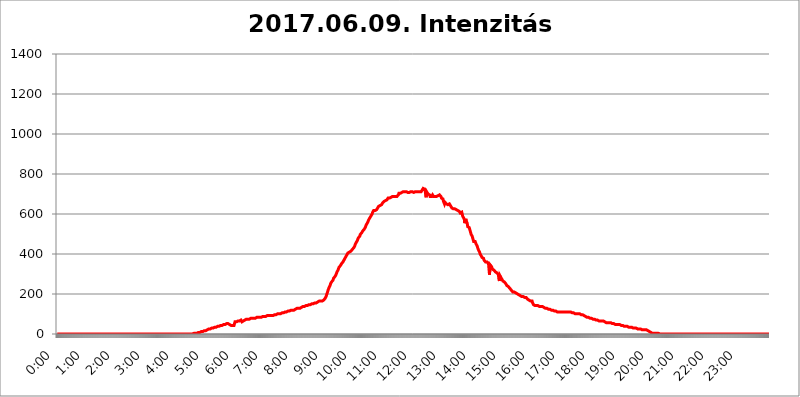
| Category | 2017.06.09. Intenzitás [W/m^2] |
|---|---|
| 0.0 | 0 |
| 0.0006944444444444445 | 0 |
| 0.001388888888888889 | 0 |
| 0.0020833333333333333 | 0 |
| 0.002777777777777778 | 0 |
| 0.003472222222222222 | 0 |
| 0.004166666666666667 | 0 |
| 0.004861111111111111 | 0 |
| 0.005555555555555556 | 0 |
| 0.0062499999999999995 | 0 |
| 0.006944444444444444 | 0 |
| 0.007638888888888889 | 0 |
| 0.008333333333333333 | 0 |
| 0.009027777777777779 | 0 |
| 0.009722222222222222 | 0 |
| 0.010416666666666666 | 0 |
| 0.011111111111111112 | 0 |
| 0.011805555555555555 | 0 |
| 0.012499999999999999 | 0 |
| 0.013194444444444444 | 0 |
| 0.013888888888888888 | 0 |
| 0.014583333333333332 | 0 |
| 0.015277777777777777 | 0 |
| 0.015972222222222224 | 0 |
| 0.016666666666666666 | 0 |
| 0.017361111111111112 | 0 |
| 0.018055555555555557 | 0 |
| 0.01875 | 0 |
| 0.019444444444444445 | 0 |
| 0.02013888888888889 | 0 |
| 0.020833333333333332 | 0 |
| 0.02152777777777778 | 0 |
| 0.022222222222222223 | 0 |
| 0.02291666666666667 | 0 |
| 0.02361111111111111 | 0 |
| 0.024305555555555556 | 0 |
| 0.024999999999999998 | 0 |
| 0.025694444444444447 | 0 |
| 0.02638888888888889 | 0 |
| 0.027083333333333334 | 0 |
| 0.027777777777777776 | 0 |
| 0.02847222222222222 | 0 |
| 0.029166666666666664 | 0 |
| 0.029861111111111113 | 0 |
| 0.030555555555555555 | 0 |
| 0.03125 | 0 |
| 0.03194444444444445 | 0 |
| 0.03263888888888889 | 0 |
| 0.03333333333333333 | 0 |
| 0.034027777777777775 | 0 |
| 0.034722222222222224 | 0 |
| 0.035416666666666666 | 0 |
| 0.036111111111111115 | 0 |
| 0.03680555555555556 | 0 |
| 0.0375 | 0 |
| 0.03819444444444444 | 0 |
| 0.03888888888888889 | 0 |
| 0.03958333333333333 | 0 |
| 0.04027777777777778 | 0 |
| 0.04097222222222222 | 0 |
| 0.041666666666666664 | 0 |
| 0.042361111111111106 | 0 |
| 0.04305555555555556 | 0 |
| 0.043750000000000004 | 0 |
| 0.044444444444444446 | 0 |
| 0.04513888888888889 | 0 |
| 0.04583333333333334 | 0 |
| 0.04652777777777778 | 0 |
| 0.04722222222222222 | 0 |
| 0.04791666666666666 | 0 |
| 0.04861111111111111 | 0 |
| 0.049305555555555554 | 0 |
| 0.049999999999999996 | 0 |
| 0.05069444444444445 | 0 |
| 0.051388888888888894 | 0 |
| 0.052083333333333336 | 0 |
| 0.05277777777777778 | 0 |
| 0.05347222222222222 | 0 |
| 0.05416666666666667 | 0 |
| 0.05486111111111111 | 0 |
| 0.05555555555555555 | 0 |
| 0.05625 | 0 |
| 0.05694444444444444 | 0 |
| 0.057638888888888885 | 0 |
| 0.05833333333333333 | 0 |
| 0.05902777777777778 | 0 |
| 0.059722222222222225 | 0 |
| 0.06041666666666667 | 0 |
| 0.061111111111111116 | 0 |
| 0.06180555555555556 | 0 |
| 0.0625 | 0 |
| 0.06319444444444444 | 0 |
| 0.06388888888888888 | 0 |
| 0.06458333333333334 | 0 |
| 0.06527777777777778 | 0 |
| 0.06597222222222222 | 0 |
| 0.06666666666666667 | 0 |
| 0.06736111111111111 | 0 |
| 0.06805555555555555 | 0 |
| 0.06874999999999999 | 0 |
| 0.06944444444444443 | 0 |
| 0.07013888888888889 | 0 |
| 0.07083333333333333 | 0 |
| 0.07152777777777779 | 0 |
| 0.07222222222222223 | 0 |
| 0.07291666666666667 | 0 |
| 0.07361111111111111 | 0 |
| 0.07430555555555556 | 0 |
| 0.075 | 0 |
| 0.07569444444444444 | 0 |
| 0.0763888888888889 | 0 |
| 0.07708333333333334 | 0 |
| 0.07777777777777778 | 0 |
| 0.07847222222222222 | 0 |
| 0.07916666666666666 | 0 |
| 0.0798611111111111 | 0 |
| 0.08055555555555556 | 0 |
| 0.08125 | 0 |
| 0.08194444444444444 | 0 |
| 0.08263888888888889 | 0 |
| 0.08333333333333333 | 0 |
| 0.08402777777777777 | 0 |
| 0.08472222222222221 | 0 |
| 0.08541666666666665 | 0 |
| 0.08611111111111112 | 0 |
| 0.08680555555555557 | 0 |
| 0.08750000000000001 | 0 |
| 0.08819444444444445 | 0 |
| 0.08888888888888889 | 0 |
| 0.08958333333333333 | 0 |
| 0.09027777777777778 | 0 |
| 0.09097222222222222 | 0 |
| 0.09166666666666667 | 0 |
| 0.09236111111111112 | 0 |
| 0.09305555555555556 | 0 |
| 0.09375 | 0 |
| 0.09444444444444444 | 0 |
| 0.09513888888888888 | 0 |
| 0.09583333333333333 | 0 |
| 0.09652777777777777 | 0 |
| 0.09722222222222222 | 0 |
| 0.09791666666666667 | 0 |
| 0.09861111111111111 | 0 |
| 0.09930555555555555 | 0 |
| 0.09999999999999999 | 0 |
| 0.10069444444444443 | 0 |
| 0.1013888888888889 | 0 |
| 0.10208333333333335 | 0 |
| 0.10277777777777779 | 0 |
| 0.10347222222222223 | 0 |
| 0.10416666666666667 | 0 |
| 0.10486111111111111 | 0 |
| 0.10555555555555556 | 0 |
| 0.10625 | 0 |
| 0.10694444444444444 | 0 |
| 0.1076388888888889 | 0 |
| 0.10833333333333334 | 0 |
| 0.10902777777777778 | 0 |
| 0.10972222222222222 | 0 |
| 0.1111111111111111 | 0 |
| 0.11180555555555556 | 0 |
| 0.11180555555555556 | 0 |
| 0.1125 | 0 |
| 0.11319444444444444 | 0 |
| 0.11388888888888889 | 0 |
| 0.11458333333333333 | 0 |
| 0.11527777777777777 | 0 |
| 0.11597222222222221 | 0 |
| 0.11666666666666665 | 0 |
| 0.1173611111111111 | 0 |
| 0.11805555555555557 | 0 |
| 0.11944444444444445 | 0 |
| 0.12013888888888889 | 0 |
| 0.12083333333333333 | 0 |
| 0.12152777777777778 | 0 |
| 0.12222222222222223 | 0 |
| 0.12291666666666667 | 0 |
| 0.12291666666666667 | 0 |
| 0.12361111111111112 | 0 |
| 0.12430555555555556 | 0 |
| 0.125 | 0 |
| 0.12569444444444444 | 0 |
| 0.12638888888888888 | 0 |
| 0.12708333333333333 | 0 |
| 0.16875 | 0 |
| 0.12847222222222224 | 0 |
| 0.12916666666666668 | 0 |
| 0.12986111111111112 | 0 |
| 0.13055555555555556 | 0 |
| 0.13125 | 0 |
| 0.13194444444444445 | 0 |
| 0.1326388888888889 | 0 |
| 0.13333333333333333 | 0 |
| 0.13402777777777777 | 0 |
| 0.13402777777777777 | 0 |
| 0.13472222222222222 | 0 |
| 0.13541666666666666 | 0 |
| 0.1361111111111111 | 0 |
| 0.13749999999999998 | 0 |
| 0.13819444444444443 | 0 |
| 0.1388888888888889 | 0 |
| 0.13958333333333334 | 0 |
| 0.14027777777777778 | 0 |
| 0.14097222222222222 | 0 |
| 0.14166666666666666 | 0 |
| 0.1423611111111111 | 0 |
| 0.14305555555555557 | 0 |
| 0.14375000000000002 | 0 |
| 0.14444444444444446 | 0 |
| 0.1451388888888889 | 0 |
| 0.1451388888888889 | 0 |
| 0.14652777777777778 | 0 |
| 0.14722222222222223 | 0 |
| 0.14791666666666667 | 0 |
| 0.1486111111111111 | 0 |
| 0.14930555555555555 | 0 |
| 0.15 | 0 |
| 0.15069444444444444 | 0 |
| 0.15138888888888888 | 0 |
| 0.15208333333333332 | 0 |
| 0.15277777777777776 | 0 |
| 0.15347222222222223 | 0 |
| 0.15416666666666667 | 0 |
| 0.15486111111111112 | 0 |
| 0.15555555555555556 | 0 |
| 0.15625 | 0 |
| 0.15694444444444444 | 0 |
| 0.15763888888888888 | 0 |
| 0.15833333333333333 | 0 |
| 0.15902777777777777 | 0 |
| 0.15972222222222224 | 0 |
| 0.16041666666666668 | 0 |
| 0.16111111111111112 | 0 |
| 0.16180555555555556 | 0 |
| 0.1625 | 0 |
| 0.16319444444444445 | 0 |
| 0.1638888888888889 | 0 |
| 0.16458333333333333 | 0 |
| 0.16527777777777777 | 0 |
| 0.16597222222222222 | 0 |
| 0.16666666666666666 | 0 |
| 0.1673611111111111 | 0 |
| 0.16805555555555554 | 0 |
| 0.16874999999999998 | 0 |
| 0.16944444444444443 | 0 |
| 0.17013888888888887 | 0 |
| 0.1708333333333333 | 0 |
| 0.17152777777777775 | 0 |
| 0.17222222222222225 | 0 |
| 0.1729166666666667 | 0 |
| 0.17361111111111113 | 0 |
| 0.17430555555555557 | 0 |
| 0.17500000000000002 | 0 |
| 0.17569444444444446 | 0 |
| 0.1763888888888889 | 0 |
| 0.17708333333333334 | 0 |
| 0.17777777777777778 | 0 |
| 0.17847222222222223 | 0 |
| 0.17916666666666667 | 0 |
| 0.1798611111111111 | 0 |
| 0.18055555555555555 | 0 |
| 0.18125 | 0 |
| 0.18194444444444444 | 0 |
| 0.1826388888888889 | 0 |
| 0.18333333333333335 | 0 |
| 0.1840277777777778 | 0 |
| 0.18472222222222223 | 0 |
| 0.18541666666666667 | 0 |
| 0.18611111111111112 | 0 |
| 0.18680555555555556 | 0 |
| 0.1875 | 0 |
| 0.18819444444444444 | 0 |
| 0.18888888888888888 | 0 |
| 0.18958333333333333 | 0 |
| 0.19027777777777777 | 3.525 |
| 0.1909722222222222 | 3.525 |
| 0.19166666666666665 | 3.525 |
| 0.19236111111111112 | 3.525 |
| 0.19305555555555554 | 3.525 |
| 0.19375 | 3.525 |
| 0.19444444444444445 | 3.525 |
| 0.1951388888888889 | 3.525 |
| 0.19583333333333333 | 3.525 |
| 0.19652777777777777 | 3.525 |
| 0.19722222222222222 | 7.887 |
| 0.19791666666666666 | 7.887 |
| 0.1986111111111111 | 7.887 |
| 0.19930555555555554 | 7.887 |
| 0.19999999999999998 | 7.887 |
| 0.20069444444444443 | 12.257 |
| 0.20138888888888887 | 12.257 |
| 0.2020833333333333 | 12.257 |
| 0.2027777777777778 | 12.257 |
| 0.2034722222222222 | 12.257 |
| 0.2041666666666667 | 12.257 |
| 0.20486111111111113 | 16.636 |
| 0.20555555555555557 | 16.636 |
| 0.20625000000000002 | 16.636 |
| 0.20694444444444446 | 16.636 |
| 0.2076388888888889 | 16.636 |
| 0.20833333333333334 | 16.636 |
| 0.20902777777777778 | 21.024 |
| 0.20972222222222223 | 21.024 |
| 0.21041666666666667 | 21.024 |
| 0.2111111111111111 | 21.024 |
| 0.21180555555555555 | 21.024 |
| 0.2125 | 25.419 |
| 0.21319444444444444 | 25.419 |
| 0.2138888888888889 | 25.419 |
| 0.21458333333333335 | 25.419 |
| 0.2152777777777778 | 29.823 |
| 0.21597222222222223 | 29.823 |
| 0.21666666666666667 | 29.823 |
| 0.21736111111111112 | 29.823 |
| 0.21805555555555556 | 29.823 |
| 0.21875 | 29.823 |
| 0.21944444444444444 | 29.823 |
| 0.22013888888888888 | 34.234 |
| 0.22083333333333333 | 34.234 |
| 0.22152777777777777 | 34.234 |
| 0.2222222222222222 | 34.234 |
| 0.22291666666666665 | 34.234 |
| 0.2236111111111111 | 38.653 |
| 0.22430555555555556 | 38.653 |
| 0.225 | 38.653 |
| 0.22569444444444445 | 38.653 |
| 0.2263888888888889 | 38.653 |
| 0.22708333333333333 | 38.653 |
| 0.22777777777777777 | 38.653 |
| 0.22847222222222222 | 43.079 |
| 0.22916666666666666 | 43.079 |
| 0.2298611111111111 | 43.079 |
| 0.23055555555555554 | 43.079 |
| 0.23124999999999998 | 43.079 |
| 0.23194444444444443 | 47.511 |
| 0.23263888888888887 | 47.511 |
| 0.2333333333333333 | 47.511 |
| 0.2340277777777778 | 47.511 |
| 0.2347222222222222 | 47.511 |
| 0.2354166666666667 | 47.511 |
| 0.23611111111111113 | 47.511 |
| 0.23680555555555557 | 51.951 |
| 0.23750000000000002 | 51.951 |
| 0.23819444444444446 | 51.951 |
| 0.2388888888888889 | 51.951 |
| 0.23958333333333334 | 51.951 |
| 0.24027777777777778 | 51.951 |
| 0.24097222222222223 | 51.951 |
| 0.24166666666666667 | 47.511 |
| 0.2423611111111111 | 43.079 |
| 0.24305555555555555 | 43.079 |
| 0.24375 | 43.079 |
| 0.24444444444444446 | 43.079 |
| 0.24513888888888888 | 43.079 |
| 0.24583333333333335 | 43.079 |
| 0.2465277777777778 | 43.079 |
| 0.24722222222222223 | 43.079 |
| 0.24791666666666667 | 43.079 |
| 0.24861111111111112 | 51.951 |
| 0.24930555555555556 | 60.85 |
| 0.25 | 60.85 |
| 0.25069444444444444 | 56.398 |
| 0.2513888888888889 | 60.85 |
| 0.2520833333333333 | 65.31 |
| 0.25277777777777777 | 65.31 |
| 0.2534722222222222 | 65.31 |
| 0.25416666666666665 | 65.31 |
| 0.2548611111111111 | 65.31 |
| 0.2555555555555556 | 65.31 |
| 0.25625000000000003 | 65.31 |
| 0.2569444444444445 | 65.31 |
| 0.2576388888888889 | 69.775 |
| 0.25833333333333336 | 69.775 |
| 0.2590277777777778 | 60.85 |
| 0.25972222222222224 | 56.398 |
| 0.2604166666666667 | 60.85 |
| 0.2611111111111111 | 65.31 |
| 0.26180555555555557 | 65.31 |
| 0.2625 | 65.31 |
| 0.26319444444444445 | 69.775 |
| 0.2638888888888889 | 74.246 |
| 0.26458333333333334 | 74.246 |
| 0.2652777777777778 | 74.246 |
| 0.2659722222222222 | 74.246 |
| 0.26666666666666666 | 74.246 |
| 0.2673611111111111 | 74.246 |
| 0.26805555555555555 | 74.246 |
| 0.26875 | 74.246 |
| 0.26944444444444443 | 74.246 |
| 0.2701388888888889 | 74.246 |
| 0.2708333333333333 | 74.246 |
| 0.27152777777777776 | 78.722 |
| 0.2722222222222222 | 74.246 |
| 0.27291666666666664 | 78.722 |
| 0.2736111111111111 | 78.722 |
| 0.2743055555555555 | 78.722 |
| 0.27499999999999997 | 78.722 |
| 0.27569444444444446 | 78.722 |
| 0.27638888888888885 | 78.722 |
| 0.27708333333333335 | 78.722 |
| 0.2777777777777778 | 78.722 |
| 0.27847222222222223 | 78.722 |
| 0.2791666666666667 | 78.722 |
| 0.2798611111111111 | 83.205 |
| 0.28055555555555556 | 83.205 |
| 0.28125 | 83.205 |
| 0.28194444444444444 | 83.205 |
| 0.2826388888888889 | 83.205 |
| 0.2833333333333333 | 83.205 |
| 0.28402777777777777 | 83.205 |
| 0.2847222222222222 | 83.205 |
| 0.28541666666666665 | 83.205 |
| 0.28611111111111115 | 83.205 |
| 0.28680555555555554 | 83.205 |
| 0.28750000000000003 | 87.692 |
| 0.2881944444444445 | 87.692 |
| 0.2888888888888889 | 87.692 |
| 0.28958333333333336 | 87.692 |
| 0.2902777777777778 | 87.692 |
| 0.29097222222222224 | 87.692 |
| 0.2916666666666667 | 87.692 |
| 0.2923611111111111 | 87.692 |
| 0.29305555555555557 | 92.184 |
| 0.29375 | 92.184 |
| 0.29444444444444445 | 92.184 |
| 0.2951388888888889 | 92.184 |
| 0.29583333333333334 | 92.184 |
| 0.2965277777777778 | 92.184 |
| 0.2972222222222222 | 92.184 |
| 0.29791666666666666 | 92.184 |
| 0.2986111111111111 | 92.184 |
| 0.29930555555555555 | 92.184 |
| 0.3 | 92.184 |
| 0.30069444444444443 | 92.184 |
| 0.3013888888888889 | 96.682 |
| 0.3020833333333333 | 96.682 |
| 0.30277777777777776 | 92.184 |
| 0.3034722222222222 | 96.682 |
| 0.30416666666666664 | 96.682 |
| 0.3048611111111111 | 96.682 |
| 0.3055555555555555 | 96.682 |
| 0.30624999999999997 | 96.682 |
| 0.3069444444444444 | 96.682 |
| 0.3076388888888889 | 96.682 |
| 0.30833333333333335 | 101.184 |
| 0.3090277777777778 | 101.184 |
| 0.30972222222222223 | 101.184 |
| 0.3104166666666667 | 101.184 |
| 0.3111111111111111 | 101.184 |
| 0.31180555555555556 | 101.184 |
| 0.3125 | 101.184 |
| 0.31319444444444444 | 101.184 |
| 0.3138888888888889 | 101.184 |
| 0.3145833333333333 | 105.69 |
| 0.31527777777777777 | 105.69 |
| 0.3159722222222222 | 105.69 |
| 0.31666666666666665 | 105.69 |
| 0.31736111111111115 | 105.69 |
| 0.31805555555555554 | 110.201 |
| 0.31875000000000003 | 110.201 |
| 0.3194444444444445 | 110.201 |
| 0.3201388888888889 | 110.201 |
| 0.32083333333333336 | 110.201 |
| 0.3215277777777778 | 110.201 |
| 0.32222222222222224 | 110.201 |
| 0.3229166666666667 | 114.716 |
| 0.3236111111111111 | 114.716 |
| 0.32430555555555557 | 114.716 |
| 0.325 | 114.716 |
| 0.32569444444444445 | 114.716 |
| 0.3263888888888889 | 114.716 |
| 0.32708333333333334 | 114.716 |
| 0.3277777777777778 | 119.235 |
| 0.3284722222222222 | 119.235 |
| 0.32916666666666666 | 119.235 |
| 0.3298611111111111 | 119.235 |
| 0.33055555555555555 | 119.235 |
| 0.33125 | 123.758 |
| 0.33194444444444443 | 119.235 |
| 0.3326388888888889 | 123.758 |
| 0.3333333333333333 | 123.758 |
| 0.3340277777777778 | 123.758 |
| 0.3347222222222222 | 123.758 |
| 0.3354166666666667 | 128.284 |
| 0.3361111111111111 | 128.284 |
| 0.3368055555555556 | 128.284 |
| 0.33749999999999997 | 128.284 |
| 0.33819444444444446 | 128.284 |
| 0.33888888888888885 | 128.284 |
| 0.33958333333333335 | 128.284 |
| 0.34027777777777773 | 128.284 |
| 0.34097222222222223 | 132.814 |
| 0.3416666666666666 | 132.814 |
| 0.3423611111111111 | 132.814 |
| 0.3430555555555555 | 132.814 |
| 0.34375 | 137.347 |
| 0.3444444444444445 | 137.347 |
| 0.3451388888888889 | 137.347 |
| 0.3458333333333334 | 137.347 |
| 0.34652777777777777 | 137.347 |
| 0.34722222222222227 | 137.347 |
| 0.34791666666666665 | 137.347 |
| 0.34861111111111115 | 141.884 |
| 0.34930555555555554 | 141.884 |
| 0.35000000000000003 | 141.884 |
| 0.3506944444444444 | 141.884 |
| 0.3513888888888889 | 141.884 |
| 0.3520833333333333 | 146.423 |
| 0.3527777777777778 | 146.423 |
| 0.3534722222222222 | 146.423 |
| 0.3541666666666667 | 146.423 |
| 0.3548611111111111 | 146.423 |
| 0.35555555555555557 | 146.423 |
| 0.35625 | 146.423 |
| 0.35694444444444445 | 150.964 |
| 0.3576388888888889 | 150.964 |
| 0.35833333333333334 | 150.964 |
| 0.3590277777777778 | 150.964 |
| 0.3597222222222222 | 155.509 |
| 0.36041666666666666 | 155.509 |
| 0.3611111111111111 | 155.509 |
| 0.36180555555555555 | 155.509 |
| 0.3625 | 155.509 |
| 0.36319444444444443 | 155.509 |
| 0.3638888888888889 | 160.056 |
| 0.3645833333333333 | 160.056 |
| 0.3652777777777778 | 160.056 |
| 0.3659722222222222 | 160.056 |
| 0.3666666666666667 | 160.056 |
| 0.3673611111111111 | 164.605 |
| 0.3680555555555556 | 164.605 |
| 0.36874999999999997 | 164.605 |
| 0.36944444444444446 | 164.605 |
| 0.37013888888888885 | 164.605 |
| 0.37083333333333335 | 164.605 |
| 0.37152777777777773 | 164.605 |
| 0.37222222222222223 | 169.156 |
| 0.3729166666666666 | 169.156 |
| 0.3736111111111111 | 169.156 |
| 0.3743055555555555 | 169.156 |
| 0.375 | 173.709 |
| 0.3756944444444445 | 178.264 |
| 0.3763888888888889 | 182.82 |
| 0.3770833333333334 | 187.378 |
| 0.37777777777777777 | 196.497 |
| 0.37847222222222227 | 201.058 |
| 0.37916666666666665 | 210.182 |
| 0.37986111111111115 | 219.309 |
| 0.38055555555555554 | 223.873 |
| 0.38125000000000003 | 233 |
| 0.3819444444444444 | 237.564 |
| 0.3826388888888889 | 242.127 |
| 0.3833333333333333 | 251.251 |
| 0.3840277777777778 | 255.813 |
| 0.3847222222222222 | 260.373 |
| 0.3854166666666667 | 264.932 |
| 0.3861111111111111 | 264.932 |
| 0.38680555555555557 | 269.49 |
| 0.3875 | 278.603 |
| 0.38819444444444445 | 278.603 |
| 0.3888888888888889 | 283.156 |
| 0.38958333333333334 | 287.709 |
| 0.3902777777777778 | 292.259 |
| 0.3909722222222222 | 296.808 |
| 0.39166666666666666 | 301.354 |
| 0.3923611111111111 | 310.44 |
| 0.39305555555555555 | 314.98 |
| 0.39375 | 319.517 |
| 0.39444444444444443 | 324.052 |
| 0.3951388888888889 | 333.113 |
| 0.3958333333333333 | 333.113 |
| 0.3965277777777778 | 337.639 |
| 0.3972222222222222 | 342.162 |
| 0.3979166666666667 | 346.682 |
| 0.3986111111111111 | 351.198 |
| 0.3993055555555556 | 355.712 |
| 0.39999999999999997 | 355.712 |
| 0.40069444444444446 | 360.221 |
| 0.40138888888888885 | 364.728 |
| 0.40208333333333335 | 369.23 |
| 0.40277777777777773 | 373.729 |
| 0.40347222222222223 | 378.224 |
| 0.4041666666666666 | 382.715 |
| 0.4048611111111111 | 387.202 |
| 0.4055555555555555 | 391.685 |
| 0.40625 | 396.164 |
| 0.4069444444444445 | 400.638 |
| 0.4076388888888889 | 405.108 |
| 0.4083333333333334 | 405.108 |
| 0.40902777777777777 | 409.574 |
| 0.40972222222222227 | 409.574 |
| 0.41041666666666665 | 414.035 |
| 0.41111111111111115 | 414.035 |
| 0.41180555555555554 | 414.035 |
| 0.41250000000000003 | 418.492 |
| 0.4131944444444444 | 418.492 |
| 0.4138888888888889 | 422.943 |
| 0.4145833333333333 | 427.39 |
| 0.4152777777777778 | 427.39 |
| 0.4159722222222222 | 431.833 |
| 0.4166666666666667 | 436.27 |
| 0.4173611111111111 | 440.702 |
| 0.41805555555555557 | 449.551 |
| 0.41875 | 453.968 |
| 0.41944444444444445 | 458.38 |
| 0.4201388888888889 | 458.38 |
| 0.42083333333333334 | 467.187 |
| 0.4215277777777778 | 471.582 |
| 0.4222222222222222 | 480.356 |
| 0.42291666666666666 | 480.356 |
| 0.4236111111111111 | 484.735 |
| 0.42430555555555555 | 489.108 |
| 0.425 | 497.836 |
| 0.42569444444444443 | 497.836 |
| 0.4263888888888889 | 502.192 |
| 0.4270833333333333 | 506.542 |
| 0.4277777777777778 | 510.885 |
| 0.4284722222222222 | 515.223 |
| 0.4291666666666667 | 515.223 |
| 0.4298611111111111 | 519.555 |
| 0.4305555555555556 | 523.88 |
| 0.43124999999999997 | 528.2 |
| 0.43194444444444446 | 532.513 |
| 0.43263888888888885 | 536.82 |
| 0.43333333333333335 | 545.416 |
| 0.43402777777777773 | 549.704 |
| 0.43472222222222223 | 549.704 |
| 0.4354166666666666 | 558.261 |
| 0.4361111111111111 | 562.53 |
| 0.4368055555555555 | 571.049 |
| 0.4375 | 575.299 |
| 0.4381944444444445 | 579.542 |
| 0.4388888888888889 | 583.779 |
| 0.4395833333333334 | 583.779 |
| 0.44027777777777777 | 592.233 |
| 0.44097222222222227 | 596.45 |
| 0.44166666666666665 | 600.661 |
| 0.44236111111111115 | 609.062 |
| 0.44305555555555554 | 613.252 |
| 0.44375000000000003 | 617.436 |
| 0.4444444444444444 | 617.436 |
| 0.4451388888888889 | 617.436 |
| 0.4458333333333333 | 617.436 |
| 0.4465277777777778 | 621.613 |
| 0.4472222222222222 | 621.613 |
| 0.4479166666666667 | 621.613 |
| 0.4486111111111111 | 625.784 |
| 0.44930555555555557 | 629.948 |
| 0.45 | 634.105 |
| 0.45069444444444445 | 638.256 |
| 0.4513888888888889 | 642.4 |
| 0.45208333333333334 | 638.256 |
| 0.4527777777777778 | 642.4 |
| 0.4534722222222222 | 642.4 |
| 0.45416666666666666 | 646.537 |
| 0.4548611111111111 | 646.537 |
| 0.45555555555555555 | 650.667 |
| 0.45625 | 654.791 |
| 0.45694444444444443 | 658.909 |
| 0.4576388888888889 | 658.909 |
| 0.4583333333333333 | 663.019 |
| 0.4590277777777778 | 663.019 |
| 0.4597222222222222 | 663.019 |
| 0.4604166666666667 | 667.123 |
| 0.4611111111111111 | 671.22 |
| 0.4618055555555556 | 671.22 |
| 0.46249999999999997 | 671.22 |
| 0.46319444444444446 | 675.311 |
| 0.46388888888888885 | 679.395 |
| 0.46458333333333335 | 679.395 |
| 0.46527777777777773 | 683.473 |
| 0.46597222222222223 | 679.395 |
| 0.4666666666666666 | 679.395 |
| 0.4673611111111111 | 683.473 |
| 0.4680555555555555 | 683.473 |
| 0.46875 | 687.544 |
| 0.4694444444444445 | 687.544 |
| 0.4701388888888889 | 687.544 |
| 0.4708333333333334 | 687.544 |
| 0.47152777777777777 | 687.544 |
| 0.47222222222222227 | 687.544 |
| 0.47291666666666665 | 687.544 |
| 0.47361111111111115 | 687.544 |
| 0.47430555555555554 | 687.544 |
| 0.47500000000000003 | 683.473 |
| 0.4756944444444444 | 683.473 |
| 0.4763888888888889 | 687.544 |
| 0.4770833333333333 | 687.544 |
| 0.4777777777777778 | 691.608 |
| 0.4784722222222222 | 695.666 |
| 0.4791666666666667 | 703.762 |
| 0.4798611111111111 | 699.717 |
| 0.48055555555555557 | 703.762 |
| 0.48125 | 703.762 |
| 0.48194444444444445 | 703.762 |
| 0.4826388888888889 | 703.762 |
| 0.48333333333333334 | 707.8 |
| 0.4840277777777778 | 707.8 |
| 0.4847222222222222 | 711.832 |
| 0.48541666666666666 | 711.832 |
| 0.4861111111111111 | 711.832 |
| 0.48680555555555555 | 711.832 |
| 0.4875 | 711.832 |
| 0.48819444444444443 | 715.858 |
| 0.4888888888888889 | 711.832 |
| 0.4895833333333333 | 711.832 |
| 0.4902777777777778 | 707.8 |
| 0.4909722222222222 | 707.8 |
| 0.4916666666666667 | 707.8 |
| 0.4923611111111111 | 703.762 |
| 0.4930555555555556 | 707.8 |
| 0.49374999999999997 | 707.8 |
| 0.49444444444444446 | 707.8 |
| 0.49513888888888885 | 707.8 |
| 0.49583333333333335 | 711.832 |
| 0.49652777777777773 | 707.8 |
| 0.49722222222222223 | 711.832 |
| 0.4979166666666666 | 711.832 |
| 0.4986111111111111 | 711.832 |
| 0.4993055555555555 | 707.8 |
| 0.5 | 707.8 |
| 0.5006944444444444 | 707.8 |
| 0.5013888888888889 | 707.8 |
| 0.5020833333333333 | 711.832 |
| 0.5027777777777778 | 711.832 |
| 0.5034722222222222 | 711.832 |
| 0.5041666666666667 | 711.832 |
| 0.5048611111111111 | 711.832 |
| 0.5055555555555555 | 715.858 |
| 0.50625 | 711.832 |
| 0.5069444444444444 | 711.832 |
| 0.5076388888888889 | 711.832 |
| 0.5083333333333333 | 711.832 |
| 0.5090277777777777 | 711.832 |
| 0.5097222222222222 | 711.832 |
| 0.5104166666666666 | 711.832 |
| 0.5111111111111112 | 711.832 |
| 0.5118055555555555 | 719.877 |
| 0.5125000000000001 | 723.889 |
| 0.5131944444444444 | 727.896 |
| 0.513888888888889 | 731.896 |
| 0.5145833333333333 | 731.896 |
| 0.5152777777777778 | 723.889 |
| 0.5159722222222222 | 715.858 |
| 0.5166666666666667 | 711.832 |
| 0.517361111111111 | 683.473 |
| 0.5180555555555556 | 711.832 |
| 0.5187499999999999 | 711.832 |
| 0.5194444444444445 | 707.8 |
| 0.5201388888888888 | 699.717 |
| 0.5208333333333334 | 695.666 |
| 0.5215277777777778 | 699.717 |
| 0.5222222222222223 | 695.666 |
| 0.5229166666666667 | 687.544 |
| 0.5236111111111111 | 687.544 |
| 0.5243055555555556 | 691.608 |
| 0.525 | 687.544 |
| 0.5256944444444445 | 691.608 |
| 0.5263888888888889 | 695.666 |
| 0.5270833333333333 | 691.608 |
| 0.5277777777777778 | 687.544 |
| 0.5284722222222222 | 687.544 |
| 0.5291666666666667 | 683.473 |
| 0.5298611111111111 | 687.544 |
| 0.5305555555555556 | 687.544 |
| 0.53125 | 687.544 |
| 0.5319444444444444 | 687.544 |
| 0.5326388888888889 | 687.544 |
| 0.5333333333333333 | 691.608 |
| 0.5340277777777778 | 691.608 |
| 0.5347222222222222 | 691.608 |
| 0.5354166666666667 | 695.666 |
| 0.5361111111111111 | 695.666 |
| 0.5368055555555555 | 695.666 |
| 0.5375 | 695.666 |
| 0.5381944444444444 | 687.544 |
| 0.5388888888888889 | 679.395 |
| 0.5395833333333333 | 683.473 |
| 0.5402777777777777 | 683.473 |
| 0.5409722222222222 | 675.311 |
| 0.5416666666666666 | 663.019 |
| 0.5423611111111112 | 658.909 |
| 0.5430555555555555 | 650.667 |
| 0.5437500000000001 | 658.909 |
| 0.5444444444444444 | 654.791 |
| 0.545138888888889 | 654.791 |
| 0.5458333333333333 | 650.667 |
| 0.5465277777777778 | 654.791 |
| 0.5472222222222222 | 650.667 |
| 0.5479166666666667 | 646.537 |
| 0.548611111111111 | 650.667 |
| 0.5493055555555556 | 650.667 |
| 0.5499999999999999 | 650.667 |
| 0.5506944444444445 | 650.667 |
| 0.5513888888888888 | 646.537 |
| 0.5520833333333334 | 638.256 |
| 0.5527777777777778 | 634.105 |
| 0.5534722222222223 | 629.948 |
| 0.5541666666666667 | 625.784 |
| 0.5548611111111111 | 625.784 |
| 0.5555555555555556 | 625.784 |
| 0.55625 | 625.784 |
| 0.5569444444444445 | 625.784 |
| 0.5576388888888889 | 625.784 |
| 0.5583333333333333 | 621.613 |
| 0.5590277777777778 | 621.613 |
| 0.5597222222222222 | 621.613 |
| 0.5604166666666667 | 621.613 |
| 0.5611111111111111 | 621.613 |
| 0.5618055555555556 | 617.436 |
| 0.5625 | 617.436 |
| 0.5631944444444444 | 617.436 |
| 0.5638888888888889 | 613.252 |
| 0.5645833333333333 | 609.062 |
| 0.5652777777777778 | 604.864 |
| 0.5659722222222222 | 604.864 |
| 0.5666666666666667 | 609.062 |
| 0.5673611111111111 | 609.062 |
| 0.5680555555555555 | 604.864 |
| 0.56875 | 588.009 |
| 0.5694444444444444 | 592.233 |
| 0.5701388888888889 | 588.009 |
| 0.5708333333333333 | 575.299 |
| 0.5715277777777777 | 553.986 |
| 0.5722222222222222 | 553.986 |
| 0.5729166666666666 | 575.299 |
| 0.5736111111111112 | 566.793 |
| 0.5743055555555555 | 566.793 |
| 0.5750000000000001 | 553.986 |
| 0.5756944444444444 | 536.82 |
| 0.576388888888889 | 532.513 |
| 0.5770833333333333 | 532.513 |
| 0.5777777777777778 | 532.513 |
| 0.5784722222222222 | 523.88 |
| 0.5791666666666667 | 519.555 |
| 0.579861111111111 | 506.542 |
| 0.5805555555555556 | 497.836 |
| 0.5812499999999999 | 497.836 |
| 0.5819444444444445 | 489.108 |
| 0.5826388888888888 | 480.356 |
| 0.5833333333333334 | 471.582 |
| 0.5840277777777778 | 462.786 |
| 0.5847222222222223 | 458.38 |
| 0.5854166666666667 | 462.786 |
| 0.5861111111111111 | 462.786 |
| 0.5868055555555556 | 458.38 |
| 0.5875 | 449.551 |
| 0.5881944444444445 | 445.129 |
| 0.5888888888888889 | 440.702 |
| 0.5895833333333333 | 431.833 |
| 0.5902777777777778 | 427.39 |
| 0.5909722222222222 | 418.492 |
| 0.5916666666666667 | 414.035 |
| 0.5923611111111111 | 409.574 |
| 0.5930555555555556 | 400.638 |
| 0.59375 | 396.164 |
| 0.5944444444444444 | 391.685 |
| 0.5951388888888889 | 387.202 |
| 0.5958333333333333 | 382.715 |
| 0.5965277777777778 | 382.715 |
| 0.5972222222222222 | 378.224 |
| 0.5979166666666667 | 378.224 |
| 0.5986111111111111 | 369.23 |
| 0.5993055555555555 | 369.23 |
| 0.6 | 364.728 |
| 0.6006944444444444 | 360.221 |
| 0.6013888888888889 | 355.712 |
| 0.6020833333333333 | 360.221 |
| 0.6027777777777777 | 360.221 |
| 0.6034722222222222 | 360.221 |
| 0.6041666666666666 | 355.712 |
| 0.6048611111111112 | 351.198 |
| 0.6055555555555555 | 346.682 |
| 0.6062500000000001 | 296.808 |
| 0.6069444444444444 | 346.682 |
| 0.607638888888889 | 346.682 |
| 0.6083333333333333 | 342.162 |
| 0.6090277777777778 | 337.639 |
| 0.6097222222222222 | 333.113 |
| 0.6104166666666667 | 324.052 |
| 0.611111111111111 | 324.052 |
| 0.6118055555555556 | 319.517 |
| 0.6124999999999999 | 319.517 |
| 0.6131944444444445 | 314.98 |
| 0.6138888888888888 | 314.98 |
| 0.6145833333333334 | 310.44 |
| 0.6152777777777778 | 310.44 |
| 0.6159722222222223 | 310.44 |
| 0.6166666666666667 | 305.898 |
| 0.6173611111111111 | 305.898 |
| 0.6180555555555556 | 305.898 |
| 0.61875 | 296.808 |
| 0.6194444444444445 | 274.047 |
| 0.6201388888888889 | 264.932 |
| 0.6208333333333333 | 292.259 |
| 0.6215277777777778 | 287.709 |
| 0.6222222222222222 | 283.156 |
| 0.6229166666666667 | 278.603 |
| 0.6236111111111111 | 274.047 |
| 0.6243055555555556 | 269.49 |
| 0.625 | 264.932 |
| 0.6256944444444444 | 264.932 |
| 0.6263888888888889 | 260.373 |
| 0.6270833333333333 | 260.373 |
| 0.6277777777777778 | 260.373 |
| 0.6284722222222222 | 255.813 |
| 0.6291666666666667 | 251.251 |
| 0.6298611111111111 | 246.689 |
| 0.6305555555555555 | 242.127 |
| 0.63125 | 242.127 |
| 0.6319444444444444 | 242.127 |
| 0.6326388888888889 | 237.564 |
| 0.6333333333333333 | 233 |
| 0.6340277777777777 | 233 |
| 0.6347222222222222 | 228.436 |
| 0.6354166666666666 | 228.436 |
| 0.6361111111111112 | 223.873 |
| 0.6368055555555555 | 219.309 |
| 0.6375000000000001 | 219.309 |
| 0.6381944444444444 | 214.746 |
| 0.638888888888889 | 210.182 |
| 0.6395833333333333 | 210.182 |
| 0.6402777777777778 | 210.182 |
| 0.6409722222222222 | 210.182 |
| 0.6416666666666667 | 205.62 |
| 0.642361111111111 | 205.62 |
| 0.6430555555555556 | 205.62 |
| 0.6437499999999999 | 201.058 |
| 0.6444444444444445 | 201.058 |
| 0.6451388888888888 | 201.058 |
| 0.6458333333333334 | 201.058 |
| 0.6465277777777778 | 196.497 |
| 0.6472222222222223 | 196.497 |
| 0.6479166666666667 | 196.497 |
| 0.6486111111111111 | 191.937 |
| 0.6493055555555556 | 191.937 |
| 0.65 | 191.937 |
| 0.6506944444444445 | 191.937 |
| 0.6513888888888889 | 187.378 |
| 0.6520833333333333 | 191.937 |
| 0.6527777777777778 | 187.378 |
| 0.6534722222222222 | 187.378 |
| 0.6541666666666667 | 187.378 |
| 0.6548611111111111 | 182.82 |
| 0.6555555555555556 | 182.82 |
| 0.65625 | 182.82 |
| 0.6569444444444444 | 182.82 |
| 0.6576388888888889 | 182.82 |
| 0.6583333333333333 | 178.264 |
| 0.6590277777777778 | 178.264 |
| 0.6597222222222222 | 173.709 |
| 0.6604166666666667 | 173.709 |
| 0.6611111111111111 | 173.709 |
| 0.6618055555555555 | 169.156 |
| 0.6625 | 169.156 |
| 0.6631944444444444 | 169.156 |
| 0.6638888888888889 | 164.605 |
| 0.6645833333333333 | 164.605 |
| 0.6652777777777777 | 164.605 |
| 0.6659722222222222 | 164.605 |
| 0.6666666666666666 | 155.509 |
| 0.6673611111111111 | 150.964 |
| 0.6680555555555556 | 146.423 |
| 0.6687500000000001 | 146.423 |
| 0.6694444444444444 | 141.884 |
| 0.6701388888888888 | 141.884 |
| 0.6708333333333334 | 141.884 |
| 0.6715277777777778 | 137.347 |
| 0.6722222222222222 | 141.884 |
| 0.6729166666666666 | 141.884 |
| 0.6736111111111112 | 141.884 |
| 0.6743055555555556 | 141.884 |
| 0.6749999999999999 | 141.884 |
| 0.6756944444444444 | 137.347 |
| 0.6763888888888889 | 137.347 |
| 0.6770833333333334 | 137.347 |
| 0.6777777777777777 | 137.347 |
| 0.6784722222222223 | 137.347 |
| 0.6791666666666667 | 137.347 |
| 0.6798611111111111 | 137.347 |
| 0.6805555555555555 | 137.347 |
| 0.68125 | 132.814 |
| 0.6819444444444445 | 132.814 |
| 0.6826388888888889 | 132.814 |
| 0.6833333333333332 | 128.284 |
| 0.6840277777777778 | 128.284 |
| 0.6847222222222222 | 128.284 |
| 0.6854166666666667 | 128.284 |
| 0.686111111111111 | 128.284 |
| 0.6868055555555556 | 128.284 |
| 0.6875 | 123.758 |
| 0.6881944444444444 | 123.758 |
| 0.688888888888889 | 123.758 |
| 0.6895833333333333 | 123.758 |
| 0.6902777777777778 | 123.758 |
| 0.6909722222222222 | 123.758 |
| 0.6916666666666668 | 123.758 |
| 0.6923611111111111 | 123.758 |
| 0.6930555555555555 | 119.235 |
| 0.69375 | 119.235 |
| 0.6944444444444445 | 119.235 |
| 0.6951388888888889 | 119.235 |
| 0.6958333333333333 | 119.235 |
| 0.6965277777777777 | 114.716 |
| 0.6972222222222223 | 114.716 |
| 0.6979166666666666 | 114.716 |
| 0.6986111111111111 | 114.716 |
| 0.6993055555555556 | 114.716 |
| 0.7000000000000001 | 114.716 |
| 0.7006944444444444 | 110.201 |
| 0.7013888888888888 | 110.201 |
| 0.7020833333333334 | 110.201 |
| 0.7027777777777778 | 110.201 |
| 0.7034722222222222 | 110.201 |
| 0.7041666666666666 | 110.201 |
| 0.7048611111111112 | 110.201 |
| 0.7055555555555556 | 110.201 |
| 0.7062499999999999 | 110.201 |
| 0.7069444444444444 | 110.201 |
| 0.7076388888888889 | 110.201 |
| 0.7083333333333334 | 110.201 |
| 0.7090277777777777 | 110.201 |
| 0.7097222222222223 | 110.201 |
| 0.7104166666666667 | 110.201 |
| 0.7111111111111111 | 110.201 |
| 0.7118055555555555 | 110.201 |
| 0.7125 | 110.201 |
| 0.7131944444444445 | 110.201 |
| 0.7138888888888889 | 110.201 |
| 0.7145833333333332 | 110.201 |
| 0.7152777777777778 | 110.201 |
| 0.7159722222222222 | 110.201 |
| 0.7166666666666667 | 110.201 |
| 0.717361111111111 | 110.201 |
| 0.7180555555555556 | 110.201 |
| 0.71875 | 110.201 |
| 0.7194444444444444 | 110.201 |
| 0.720138888888889 | 110.201 |
| 0.7208333333333333 | 110.201 |
| 0.7215277777777778 | 110.201 |
| 0.7222222222222222 | 105.69 |
| 0.7229166666666668 | 105.69 |
| 0.7236111111111111 | 105.69 |
| 0.7243055555555555 | 105.69 |
| 0.725 | 105.69 |
| 0.7256944444444445 | 101.184 |
| 0.7263888888888889 | 101.184 |
| 0.7270833333333333 | 101.184 |
| 0.7277777777777777 | 101.184 |
| 0.7284722222222223 | 101.184 |
| 0.7291666666666666 | 101.184 |
| 0.7298611111111111 | 101.184 |
| 0.7305555555555556 | 101.184 |
| 0.7312500000000001 | 101.184 |
| 0.7319444444444444 | 101.184 |
| 0.7326388888888888 | 101.184 |
| 0.7333333333333334 | 101.184 |
| 0.7340277777777778 | 96.682 |
| 0.7347222222222222 | 96.682 |
| 0.7354166666666666 | 96.682 |
| 0.7361111111111112 | 96.682 |
| 0.7368055555555556 | 96.682 |
| 0.7374999999999999 | 92.184 |
| 0.7381944444444444 | 92.184 |
| 0.7388888888888889 | 92.184 |
| 0.7395833333333334 | 92.184 |
| 0.7402777777777777 | 87.692 |
| 0.7409722222222223 | 87.692 |
| 0.7416666666666667 | 87.692 |
| 0.7423611111111111 | 83.205 |
| 0.7430555555555555 | 83.205 |
| 0.74375 | 83.205 |
| 0.7444444444444445 | 83.205 |
| 0.7451388888888889 | 83.205 |
| 0.7458333333333332 | 83.205 |
| 0.7465277777777778 | 78.722 |
| 0.7472222222222222 | 78.722 |
| 0.7479166666666667 | 78.722 |
| 0.748611111111111 | 78.722 |
| 0.7493055555555556 | 78.722 |
| 0.75 | 78.722 |
| 0.7506944444444444 | 74.246 |
| 0.751388888888889 | 74.246 |
| 0.7520833333333333 | 74.246 |
| 0.7527777777777778 | 74.246 |
| 0.7534722222222222 | 74.246 |
| 0.7541666666666668 | 74.246 |
| 0.7548611111111111 | 74.246 |
| 0.7555555555555555 | 69.775 |
| 0.75625 | 69.775 |
| 0.7569444444444445 | 69.775 |
| 0.7576388888888889 | 69.775 |
| 0.7583333333333333 | 69.775 |
| 0.7590277777777777 | 65.31 |
| 0.7597222222222223 | 65.31 |
| 0.7604166666666666 | 65.31 |
| 0.7611111111111111 | 65.31 |
| 0.7618055555555556 | 65.31 |
| 0.7625000000000001 | 65.31 |
| 0.7631944444444444 | 65.31 |
| 0.7638888888888888 | 65.31 |
| 0.7645833333333334 | 65.31 |
| 0.7652777777777778 | 65.31 |
| 0.7659722222222222 | 65.31 |
| 0.7666666666666666 | 60.85 |
| 0.7673611111111112 | 60.85 |
| 0.7680555555555556 | 60.85 |
| 0.7687499999999999 | 60.85 |
| 0.7694444444444444 | 60.85 |
| 0.7701388888888889 | 56.398 |
| 0.7708333333333334 | 56.398 |
| 0.7715277777777777 | 56.398 |
| 0.7722222222222223 | 56.398 |
| 0.7729166666666667 | 56.398 |
| 0.7736111111111111 | 56.398 |
| 0.7743055555555555 | 56.398 |
| 0.775 | 56.398 |
| 0.7756944444444445 | 56.398 |
| 0.7763888888888889 | 56.398 |
| 0.7770833333333332 | 51.951 |
| 0.7777777777777778 | 51.951 |
| 0.7784722222222222 | 51.951 |
| 0.7791666666666667 | 51.951 |
| 0.779861111111111 | 51.951 |
| 0.7805555555555556 | 51.951 |
| 0.78125 | 51.951 |
| 0.7819444444444444 | 51.951 |
| 0.782638888888889 | 47.511 |
| 0.7833333333333333 | 47.511 |
| 0.7840277777777778 | 47.511 |
| 0.7847222222222222 | 47.511 |
| 0.7854166666666668 | 47.511 |
| 0.7861111111111111 | 47.511 |
| 0.7868055555555555 | 47.511 |
| 0.7875 | 47.511 |
| 0.7881944444444445 | 47.511 |
| 0.7888888888888889 | 47.511 |
| 0.7895833333333333 | 43.079 |
| 0.7902777777777777 | 43.079 |
| 0.7909722222222223 | 43.079 |
| 0.7916666666666666 | 43.079 |
| 0.7923611111111111 | 43.079 |
| 0.7930555555555556 | 43.079 |
| 0.7937500000000001 | 38.653 |
| 0.7944444444444444 | 38.653 |
| 0.7951388888888888 | 38.653 |
| 0.7958333333333334 | 38.653 |
| 0.7965277777777778 | 38.653 |
| 0.7972222222222222 | 38.653 |
| 0.7979166666666666 | 38.653 |
| 0.7986111111111112 | 38.653 |
| 0.7993055555555556 | 38.653 |
| 0.7999999999999999 | 38.653 |
| 0.8006944444444444 | 38.653 |
| 0.8013888888888889 | 34.234 |
| 0.8020833333333334 | 34.234 |
| 0.8027777777777777 | 34.234 |
| 0.8034722222222223 | 34.234 |
| 0.8041666666666667 | 34.234 |
| 0.8048611111111111 | 34.234 |
| 0.8055555555555555 | 34.234 |
| 0.80625 | 34.234 |
| 0.8069444444444445 | 29.823 |
| 0.8076388888888889 | 29.823 |
| 0.8083333333333332 | 29.823 |
| 0.8090277777777778 | 29.823 |
| 0.8097222222222222 | 29.823 |
| 0.8104166666666667 | 29.823 |
| 0.811111111111111 | 29.823 |
| 0.8118055555555556 | 29.823 |
| 0.8125 | 29.823 |
| 0.8131944444444444 | 29.823 |
| 0.813888888888889 | 25.419 |
| 0.8145833333333333 | 25.419 |
| 0.8152777777777778 | 25.419 |
| 0.8159722222222222 | 25.419 |
| 0.8166666666666668 | 25.419 |
| 0.8173611111111111 | 25.419 |
| 0.8180555555555555 | 25.419 |
| 0.81875 | 25.419 |
| 0.8194444444444445 | 25.419 |
| 0.8201388888888889 | 21.024 |
| 0.8208333333333333 | 21.024 |
| 0.8215277777777777 | 21.024 |
| 0.8222222222222223 | 21.024 |
| 0.8229166666666666 | 21.024 |
| 0.8236111111111111 | 21.024 |
| 0.8243055555555556 | 21.024 |
| 0.8250000000000001 | 21.024 |
| 0.8256944444444444 | 21.024 |
| 0.8263888888888888 | 21.024 |
| 0.8270833333333334 | 16.636 |
| 0.8277777777777778 | 16.636 |
| 0.8284722222222222 | 16.636 |
| 0.8291666666666666 | 12.257 |
| 0.8298611111111112 | 12.257 |
| 0.8305555555555556 | 12.257 |
| 0.8312499999999999 | 12.257 |
| 0.8319444444444444 | 7.887 |
| 0.8326388888888889 | 7.887 |
| 0.8333333333333334 | 7.887 |
| 0.8340277777777777 | 7.887 |
| 0.8347222222222223 | 3.525 |
| 0.8354166666666667 | 3.525 |
| 0.8361111111111111 | 3.525 |
| 0.8368055555555555 | 3.525 |
| 0.8375 | 3.525 |
| 0.8381944444444445 | 3.525 |
| 0.8388888888888889 | 3.525 |
| 0.8395833333333332 | 3.525 |
| 0.8402777777777778 | 3.525 |
| 0.8409722222222222 | 3.525 |
| 0.8416666666666667 | 3.525 |
| 0.842361111111111 | 3.525 |
| 0.8430555555555556 | 3.525 |
| 0.84375 | 0 |
| 0.8444444444444444 | 0 |
| 0.845138888888889 | 0 |
| 0.8458333333333333 | 0 |
| 0.8465277777777778 | 0 |
| 0.8472222222222222 | 0 |
| 0.8479166666666668 | 0 |
| 0.8486111111111111 | 0 |
| 0.8493055555555555 | 0 |
| 0.85 | 0 |
| 0.8506944444444445 | 0 |
| 0.8513888888888889 | 0 |
| 0.8520833333333333 | 0 |
| 0.8527777777777777 | 0 |
| 0.8534722222222223 | 0 |
| 0.8541666666666666 | 0 |
| 0.8548611111111111 | 0 |
| 0.8555555555555556 | 0 |
| 0.8562500000000001 | 0 |
| 0.8569444444444444 | 0 |
| 0.8576388888888888 | 0 |
| 0.8583333333333334 | 0 |
| 0.8590277777777778 | 0 |
| 0.8597222222222222 | 0 |
| 0.8604166666666666 | 0 |
| 0.8611111111111112 | 0 |
| 0.8618055555555556 | 0 |
| 0.8624999999999999 | 0 |
| 0.8631944444444444 | 0 |
| 0.8638888888888889 | 0 |
| 0.8645833333333334 | 0 |
| 0.8652777777777777 | 0 |
| 0.8659722222222223 | 0 |
| 0.8666666666666667 | 0 |
| 0.8673611111111111 | 0 |
| 0.8680555555555555 | 0 |
| 0.86875 | 0 |
| 0.8694444444444445 | 0 |
| 0.8701388888888889 | 0 |
| 0.8708333333333332 | 0 |
| 0.8715277777777778 | 0 |
| 0.8722222222222222 | 0 |
| 0.8729166666666667 | 0 |
| 0.873611111111111 | 0 |
| 0.8743055555555556 | 0 |
| 0.875 | 0 |
| 0.8756944444444444 | 0 |
| 0.876388888888889 | 0 |
| 0.8770833333333333 | 0 |
| 0.8777777777777778 | 0 |
| 0.8784722222222222 | 0 |
| 0.8791666666666668 | 0 |
| 0.8798611111111111 | 0 |
| 0.8805555555555555 | 0 |
| 0.88125 | 0 |
| 0.8819444444444445 | 0 |
| 0.8826388888888889 | 0 |
| 0.8833333333333333 | 0 |
| 0.8840277777777777 | 0 |
| 0.8847222222222223 | 0 |
| 0.8854166666666666 | 0 |
| 0.8861111111111111 | 0 |
| 0.8868055555555556 | 0 |
| 0.8875000000000001 | 0 |
| 0.8881944444444444 | 0 |
| 0.8888888888888888 | 0 |
| 0.8895833333333334 | 0 |
| 0.8902777777777778 | 0 |
| 0.8909722222222222 | 0 |
| 0.8916666666666666 | 0 |
| 0.8923611111111112 | 0 |
| 0.8930555555555556 | 0 |
| 0.8937499999999999 | 0 |
| 0.8944444444444444 | 0 |
| 0.8951388888888889 | 0 |
| 0.8958333333333334 | 0 |
| 0.8965277777777777 | 0 |
| 0.8972222222222223 | 0 |
| 0.8979166666666667 | 0 |
| 0.8986111111111111 | 0 |
| 0.8993055555555555 | 0 |
| 0.9 | 0 |
| 0.9006944444444445 | 0 |
| 0.9013888888888889 | 0 |
| 0.9020833333333332 | 0 |
| 0.9027777777777778 | 0 |
| 0.9034722222222222 | 0 |
| 0.9041666666666667 | 0 |
| 0.904861111111111 | 0 |
| 0.9055555555555556 | 0 |
| 0.90625 | 0 |
| 0.9069444444444444 | 0 |
| 0.907638888888889 | 0 |
| 0.9083333333333333 | 0 |
| 0.9090277777777778 | 0 |
| 0.9097222222222222 | 0 |
| 0.9104166666666668 | 0 |
| 0.9111111111111111 | 0 |
| 0.9118055555555555 | 0 |
| 0.9125 | 0 |
| 0.9131944444444445 | 0 |
| 0.9138888888888889 | 0 |
| 0.9145833333333333 | 0 |
| 0.9152777777777777 | 0 |
| 0.9159722222222223 | 0 |
| 0.9166666666666666 | 0 |
| 0.9173611111111111 | 0 |
| 0.9180555555555556 | 0 |
| 0.9187500000000001 | 0 |
| 0.9194444444444444 | 0 |
| 0.9201388888888888 | 0 |
| 0.9208333333333334 | 0 |
| 0.9215277777777778 | 0 |
| 0.9222222222222222 | 0 |
| 0.9229166666666666 | 0 |
| 0.9236111111111112 | 0 |
| 0.9243055555555556 | 0 |
| 0.9249999999999999 | 0 |
| 0.9256944444444444 | 0 |
| 0.9263888888888889 | 0 |
| 0.9270833333333334 | 0 |
| 0.9277777777777777 | 0 |
| 0.9284722222222223 | 0 |
| 0.9291666666666667 | 0 |
| 0.9298611111111111 | 0 |
| 0.9305555555555555 | 0 |
| 0.93125 | 0 |
| 0.9319444444444445 | 0 |
| 0.9326388888888889 | 0 |
| 0.9333333333333332 | 0 |
| 0.9340277777777778 | 0 |
| 0.9347222222222222 | 0 |
| 0.9354166666666667 | 0 |
| 0.936111111111111 | 0 |
| 0.9368055555555556 | 0 |
| 0.9375 | 0 |
| 0.9381944444444444 | 0 |
| 0.938888888888889 | 0 |
| 0.9395833333333333 | 0 |
| 0.9402777777777778 | 0 |
| 0.9409722222222222 | 0 |
| 0.9416666666666668 | 0 |
| 0.9423611111111111 | 0 |
| 0.9430555555555555 | 0 |
| 0.94375 | 0 |
| 0.9444444444444445 | 0 |
| 0.9451388888888889 | 0 |
| 0.9458333333333333 | 0 |
| 0.9465277777777777 | 0 |
| 0.9472222222222223 | 0 |
| 0.9479166666666666 | 0 |
| 0.9486111111111111 | 0 |
| 0.9493055555555556 | 0 |
| 0.9500000000000001 | 0 |
| 0.9506944444444444 | 0 |
| 0.9513888888888888 | 0 |
| 0.9520833333333334 | 0 |
| 0.9527777777777778 | 0 |
| 0.9534722222222222 | 0 |
| 0.9541666666666666 | 0 |
| 0.9548611111111112 | 0 |
| 0.9555555555555556 | 0 |
| 0.9562499999999999 | 0 |
| 0.9569444444444444 | 0 |
| 0.9576388888888889 | 0 |
| 0.9583333333333334 | 0 |
| 0.9590277777777777 | 0 |
| 0.9597222222222223 | 0 |
| 0.9604166666666667 | 0 |
| 0.9611111111111111 | 0 |
| 0.9618055555555555 | 0 |
| 0.9625 | 0 |
| 0.9631944444444445 | 0 |
| 0.9638888888888889 | 0 |
| 0.9645833333333332 | 0 |
| 0.9652777777777778 | 0 |
| 0.9659722222222222 | 0 |
| 0.9666666666666667 | 0 |
| 0.967361111111111 | 0 |
| 0.9680555555555556 | 0 |
| 0.96875 | 0 |
| 0.9694444444444444 | 0 |
| 0.970138888888889 | 0 |
| 0.9708333333333333 | 0 |
| 0.9715277777777778 | 0 |
| 0.9722222222222222 | 0 |
| 0.9729166666666668 | 0 |
| 0.9736111111111111 | 0 |
| 0.9743055555555555 | 0 |
| 0.975 | 0 |
| 0.9756944444444445 | 0 |
| 0.9763888888888889 | 0 |
| 0.9770833333333333 | 0 |
| 0.9777777777777777 | 0 |
| 0.9784722222222223 | 0 |
| 0.9791666666666666 | 0 |
| 0.9798611111111111 | 0 |
| 0.9805555555555556 | 0 |
| 0.9812500000000001 | 0 |
| 0.9819444444444444 | 0 |
| 0.9826388888888888 | 0 |
| 0.9833333333333334 | 0 |
| 0.9840277777777778 | 0 |
| 0.9847222222222222 | 0 |
| 0.9854166666666666 | 0 |
| 0.9861111111111112 | 0 |
| 0.9868055555555556 | 0 |
| 0.9874999999999999 | 0 |
| 0.9881944444444444 | 0 |
| 0.9888888888888889 | 0 |
| 0.9895833333333334 | 0 |
| 0.9902777777777777 | 0 |
| 0.9909722222222223 | 0 |
| 0.9916666666666667 | 0 |
| 0.9923611111111111 | 0 |
| 0.9930555555555555 | 0 |
| 0.99375 | 0 |
| 0.9944444444444445 | 0 |
| 0.9951388888888889 | 0 |
| 0.9958333333333332 | 0 |
| 0.9965277777777778 | 0 |
| 0.9972222222222222 | 0 |
| 0.9979166666666667 | 0 |
| 0.998611111111111 | 0 |
| 0.9993055555555556 | 0 |